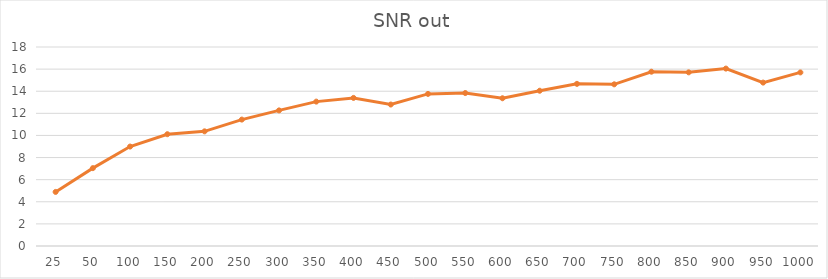
| Category | SNR out |
|---|---|
| 25.0 | 4.892 |
| 50.0 | 7.042 |
| 100.0 | 8.995 |
| 150.0 | 10.111 |
| 200.0 | 10.371 |
| 250.0 | 11.435 |
| 300.0 | 12.265 |
| 350.0 | 13.06 |
| 400.0 | 13.395 |
| 450.0 | 12.797 |
| 500.0 | 13.757 |
| 550.0 | 13.836 |
| 600.0 | 13.364 |
| 650.0 | 14.044 |
| 700.0 | 14.666 |
| 750.0 | 14.625 |
| 800.0 | 15.765 |
| 850.0 | 15.708 |
| 900.0 | 16.047 |
| 950.0 | 14.781 |
| 1000.0 | 15.7 |